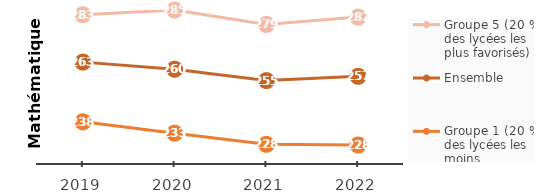
| Category | Groupe 5 (20 % des lycées les plus favorisés) | Ensemble | Groupe 1 (20 % des lycées les moins favorisés) |
|---|---|---|---|
| 2019.0 | 283 | 263 | 237.812 |
| 2020.0 | 285 | 260 | 233 |
| 2021.0 | 278.9 | 255.2 | 228.3 |
| 2022.0 | 282 | 257 | 228 |